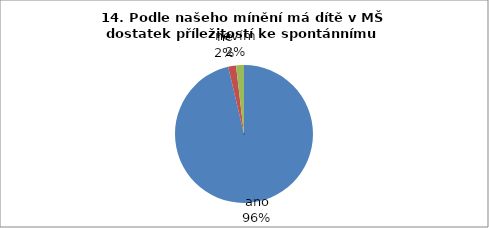
| Category | 14. |
|---|---|
| ano | 52 |
| ne | 1 |
| nevím | 1 |